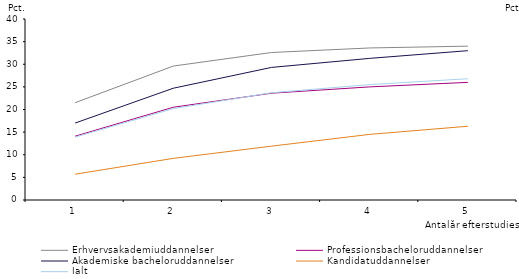
| Category | Erhvervsakademiuddannelser | Professionsbacheloruddannelser | Akademiske bacheloruddannelser | Kandidatuddannelser | Ialt |
|---|---|---|---|---|---|
| 1.0 | 21.5 | 14.1 | 17 | 5.7 | 13.9 |
| 2.0 | 29.6 | 20.5 | 24.7 | 9.2 | 20.2 |
| 3.0 | 32.6 | 23.6 | 29.3 | 11.9 | 23.7 |
| 4.0 | 33.6 | 25 | 31.3 | 14.5 | 25.5 |
| 5.0 | 34 | 26 | 33 | 16.3 | 26.8 |